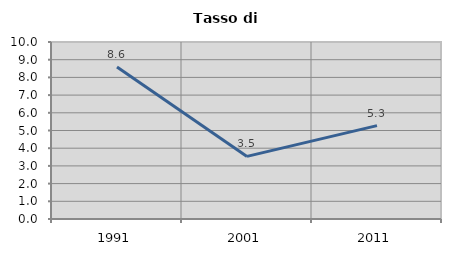
| Category | Tasso di disoccupazione   |
|---|---|
| 1991.0 | 8.586 |
| 2001.0 | 3.537 |
| 2011.0 | 5.277 |